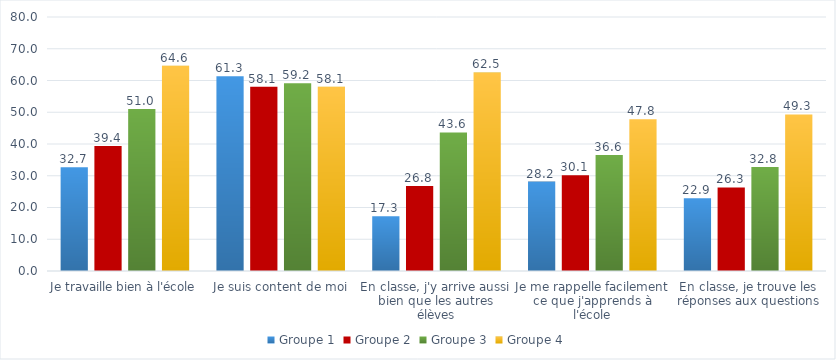
| Category | Groupe 1 | Groupe 2 | Groupe 3 | Groupe 4 |
|---|---|---|---|---|
| Je travaille bien à l'école | 32.71 | 39.39 | 51.04 | 64.62 |
| Je suis content de moi | 61.31 | 58.07 | 59.16 | 58.05 |
| En classe, j'y arrive aussi bien que les autres élèves | 17.28 | 26.76 | 43.64 | 62.52 |
| Je me rappelle facilement ce que j'apprends à l'école | 28.17 | 30.13 | 36.56 | 47.81 |
| En classe, je trouve les réponses aux questions | 22.88 | 26.31 | 32.76 | 49.32 |